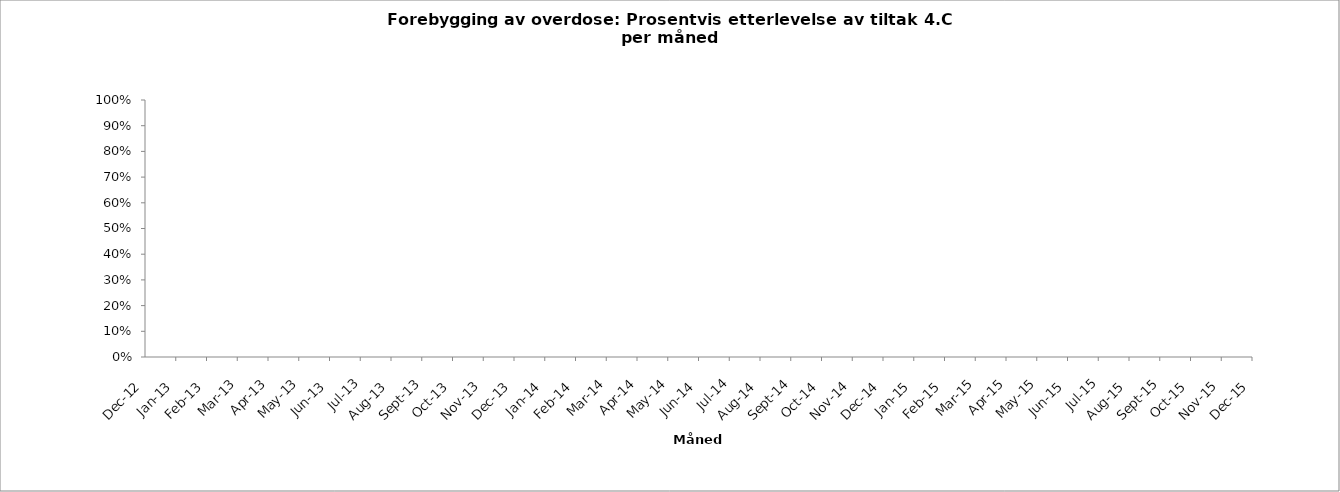
| Category | p_P7 | m_P7 |
|---|---|---|
| 2012-12-01 |  | 0 |
| 2013-01-01 |  | 0 |
| 2013-02-01 |  | 0 |
| 2013-03-01 |  | 0 |
| 2013-04-01 |  | 0 |
| 2013-05-01 |  | 0 |
| 2013-06-01 |  | 0 |
| 2013-07-01 |  | 0 |
| 2013-08-01 |  | 0 |
| 2013-09-01 |  | 0 |
| 2013-10-01 |  | 0 |
| 2013-11-01 |  | 0 |
| 2013-12-01 |  | 0 |
| 2014-01-01 |  | 0 |
| 2014-02-01 |  | 0 |
| 2014-03-01 |  | 0 |
| 2014-04-01 |  | 0 |
| 2014-05-01 |  | 0 |
| 2014-06-01 |  | 0 |
| 2014-07-01 |  | 0 |
| 2014-08-01 |  | 0 |
| 2014-09-01 |  | 0 |
| 2014-10-01 |  | 0 |
| 2014-11-01 |  | 0 |
| 2014-12-01 |  | 0 |
| 2015-01-01 |  | 0 |
| 2015-02-01 |  | 0 |
| 2015-03-01 |  | 0 |
| 2015-04-01 |  | 0 |
| 2015-05-01 |  | 0 |
| 2015-06-01 |  | 0 |
| 2015-07-01 |  | 0 |
| 2015-08-01 |  | 0 |
| 2015-09-01 |  | 0 |
| 2015-10-01 |  | 0 |
| 2015-11-01 |  | 0 |
| 2015-12-01 |  | 0 |